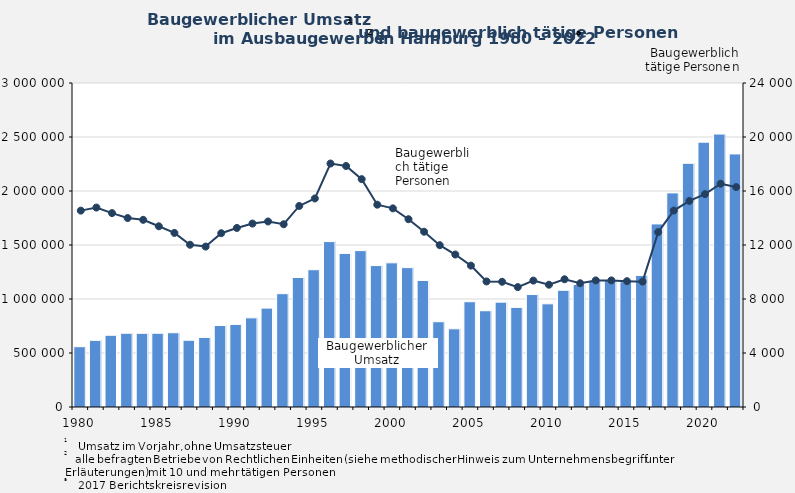
| Category | Baugewerblicher Umsatz in 1 000 Euro |
|---|---|
| 1980.0 | 558223 |
| 1981.0 | 617133 |
| 1982.0 | 664280 |
| 1983.0 | 682951 |
| 1984.0 | 682077 |
| 1985.0 | 682808 |
| 1986.0 | 687640 |
| 1987.0 | 617914 |
| 1988.0 | 644031 |
| 1989.0 | 754232 |
| 1990.0 | 764877 |
| 1991.0 | 825387 |
| 1992.0 | 915545 |
| 1993.0 | 1049292 |
| 1994.0 | 1199141 |
| 1995.0 | 1270896 |
| 1996.0 | 1531552 |
| 1997.0 | 1422133 |
| 1998.0 | 1448129 |
| 1999.0 | 1309526 |
| 2000.0 | 1334948 |
| 2001.0 | 1290538 |
| 2002.0 | 1171909 |
| 2003.0 | 789522 |
| 2004.0 | 724044 |
| 2005.0 | 974614 |
| 2006.0 | 891400 |
| 2007.0 | 970979 |
| 2008.0 | 922350 |
| 2009.0 | 1041413 |
| 2010.0 | 955419 |
| 2011.0 | 1080802 |
| 2012.0 | 1134409 |
| 2013.0 | 1164961 |
| 2014.0 | 1174909 |
| 2015.0 | 1160016 |
| 2016.0 | 1218133 |
| 2017.0 | 1695311 |
| 2018.0 | 1982401 |
| 2019.0 | 2256556 |
| 2020.0 | 2452082 |
| 2021.0 | 2527275 |
| 2022.0 | 2343113 |